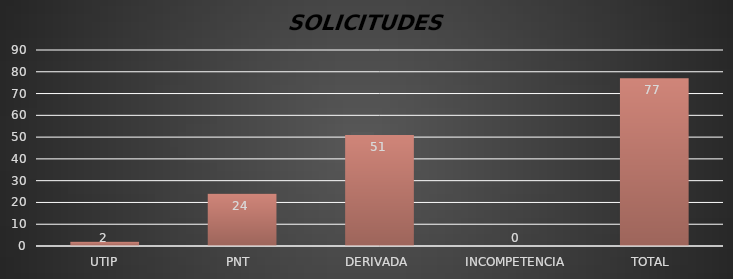
| Category | Series 1 |
|---|---|
| UTIP | 2 |
| PNT  | 24 |
| DERIVADA  | 51 |
| INCOMPETENCIA | 0 |
| TOTAL  | 77 |